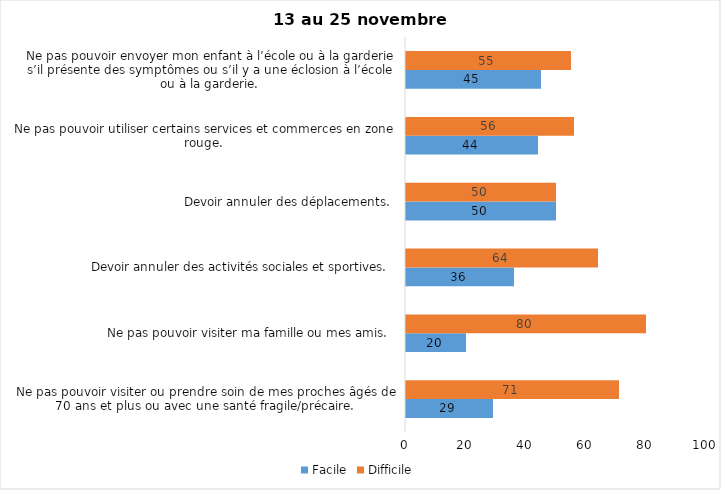
| Category | Facile | Difficile |
|---|---|---|
| Ne pas pouvoir visiter ou prendre soin de mes proches âgés de 70 ans et plus ou avec une santé fragile/précaire.  | 29 | 71 |
| Ne pas pouvoir visiter ma famille ou mes amis.  | 20 | 80 |
| Devoir annuler des activités sociales et sportives.  | 36 | 64 |
| Devoir annuler des déplacements.  | 50 | 50 |
| Ne pas pouvoir utiliser certains services et commerces en zone rouge.  | 44 | 56 |
| Ne pas pouvoir envoyer mon enfant à l’école ou à la garderie s’il présente des symptômes ou s’il y a une éclosion à l’école ou à la garderie.  | 45 | 55 |